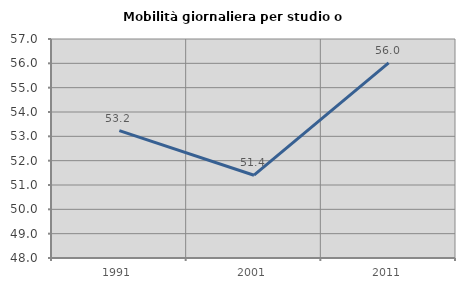
| Category | Mobilità giornaliera per studio o lavoro |
|---|---|
| 1991.0 | 53.234 |
| 2001.0 | 51.402 |
| 2011.0 | 56.017 |